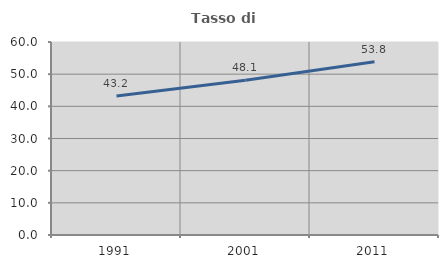
| Category | Tasso di occupazione   |
|---|---|
| 1991.0 | 43.21 |
| 2001.0 | 48.101 |
| 2011.0 | 53.846 |